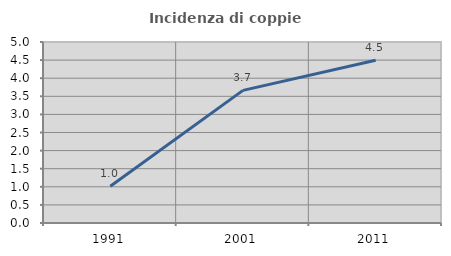
| Category | Incidenza di coppie miste |
|---|---|
| 1991.0 | 1.014 |
| 2001.0 | 3.664 |
| 2011.0 | 4.495 |